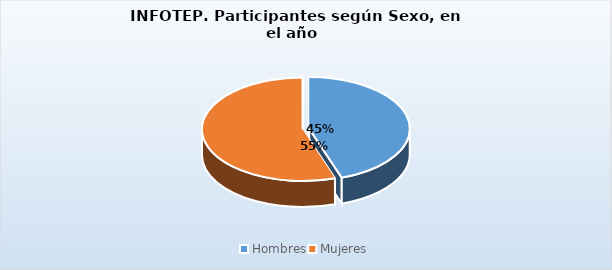
| Category | Series 0 |
|---|---|
| Hombres | 350440 |
| Mujeres | 432325 |